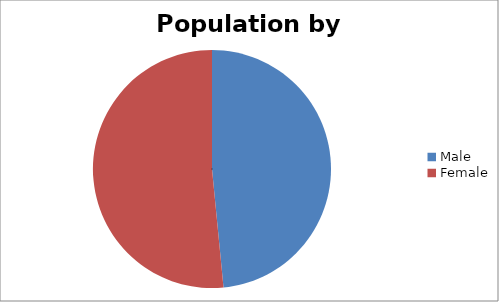
| Category | Series 0 |
|---|---|
| Male | 251 |
| Female | 267 |